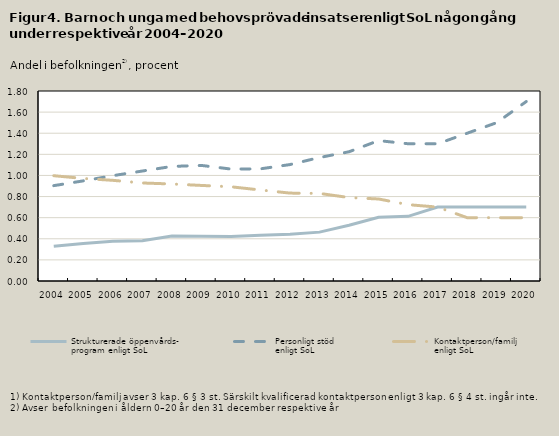
| Category | Strukturerade öppenvårds-
program enligt SoL | Personligt stöd 
enligt SoL | Kontaktperson/familj 
enligt SoL |
|---|---|---|---|
| 2004.0 | 0.329 | 0.903 | 0.997 |
| 2005.0 | 0.356 | 0.949 | 0.972 |
| 2006.0 | 0.376 | 0.998 | 0.954 |
| 2007.0 | 0.381 | 1.042 | 0.929 |
| 2008.0 | 0.426 | 1.085 | 0.919 |
| 2009.0 | 0.425 | 1.095 | 0.905 |
| 2010.0 | 0.421 | 1.061 | 0.893 |
| 2011.0 | 0.435 | 1.062 | 0.862 |
| 2012.0 | 0.443 | 1.103 | 0.833 |
| 2013.0 | 0.463 | 1.17 | 0.83 |
| 2014.0 | 0.528 | 1.224 | 0.79 |
| 2015.0 | 0.604 | 1.33 | 0.777 |
| 2016.0 | 0.613 | 1.3 | 0.723 |
| 2017.0 | 0.7 | 1.3 | 0.7 |
| 2018.0 | 0.7 | 1.4 | 0.6 |
| 2019.0 | 0.7 | 1.5 | 0.6 |
| 2020.0 | 0.7 | 1.7 | 0.6 |